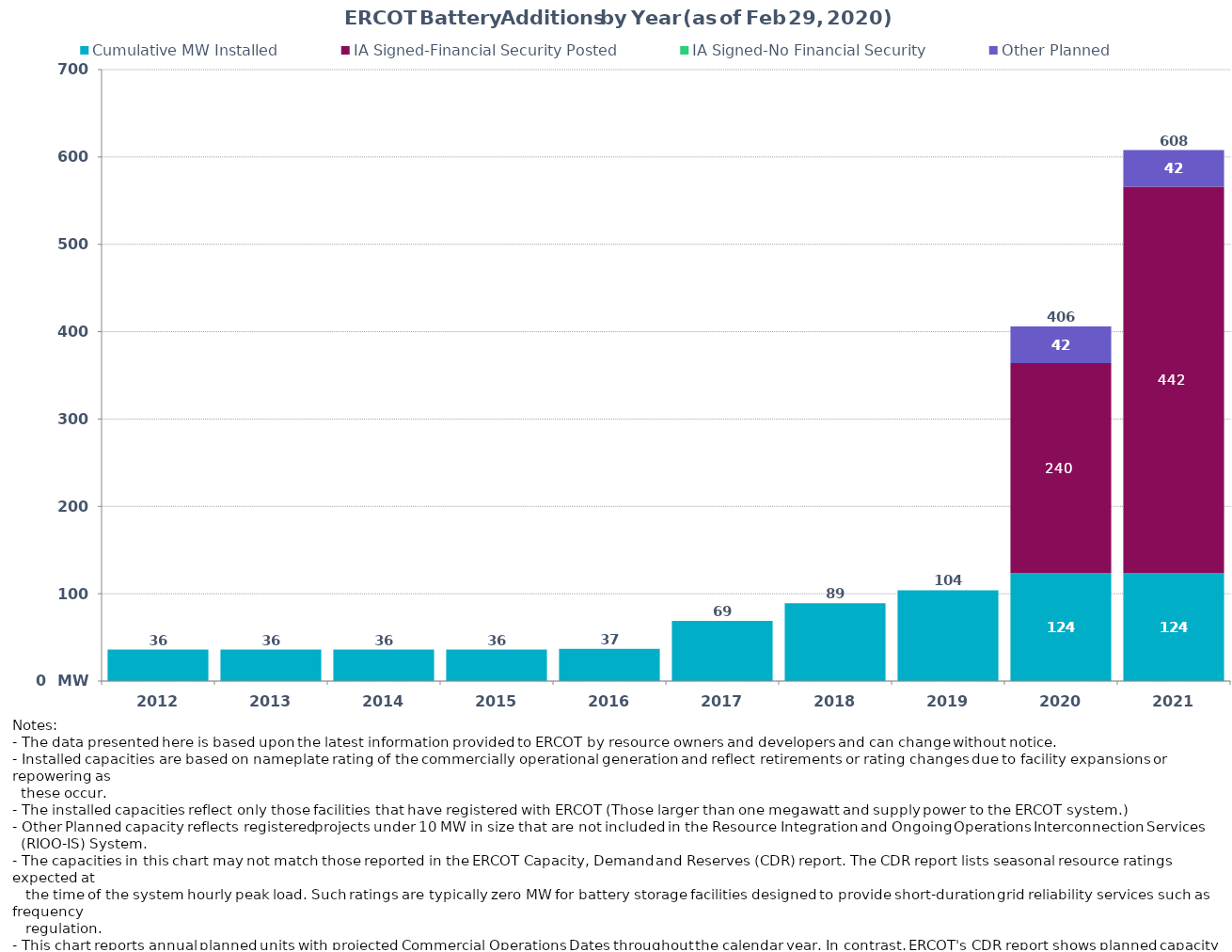
| Category | Cumulative MW Installed | IA Signed-Financial Security Posted  | IA Signed-No Financial Security  | Other Planned | Cumulative Installed and Planned |
|---|---|---|---|---|---|
| 2012.0 | 36 | 0 | 0 | 0 | 36 |
| 2013.0 | 36 | 0 | 0 | 0 | 36 |
| 2014.0 | 36 | 0 | 0 | 0 | 36 |
| 2015.0 | 36 | 0 | 0 | 0 | 36 |
| 2016.0 | 37 | 0 | 0 | 0 | 37 |
| 2017.0 | 69 | 0 | 0 | 0 | 69 |
| 2018.0 | 89 | 0 | 0 | 0 | 89 |
| 2019.0 | 104 | 0 | 0 | 0 | 104 |
| 2020.0 | 123.7 | 240.26 | 0 | 41.95 | 405.91 |
| 2021.0 | 123.7 | 442.22 | 0 | 41.95 | 607.87 |